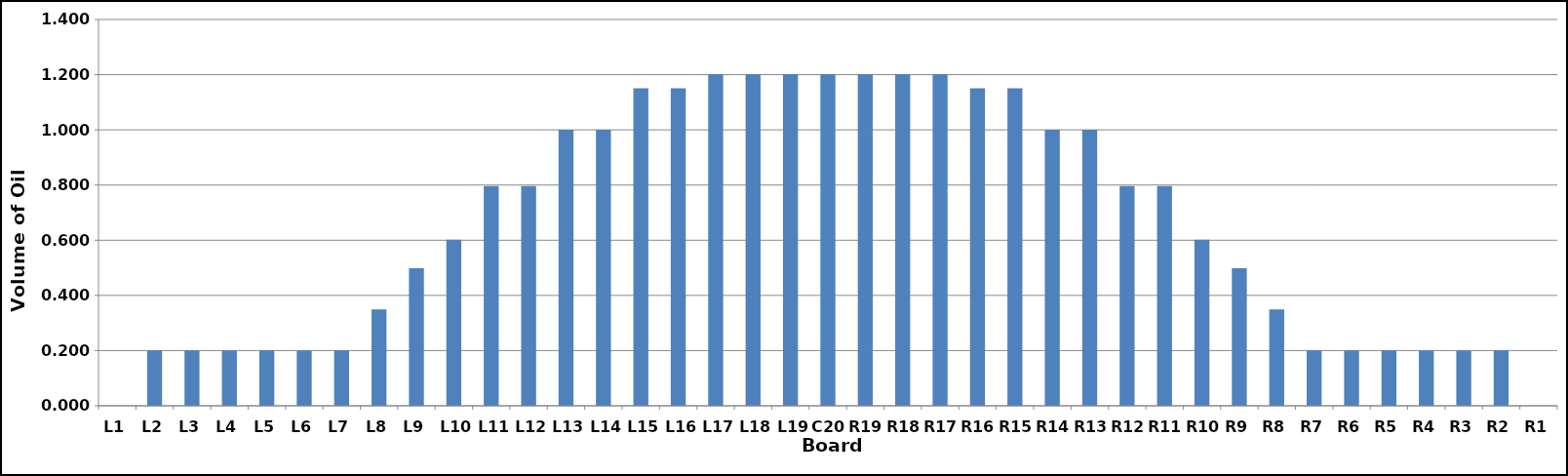
| Category | Series 0 |
|---|---|
| L1 | 0 |
| L2 | 0.2 |
| L3 | 0.2 |
| L4 | 0.2 |
| L5 | 0.2 |
| L6 | 0.2 |
| L7 | 0.2 |
| L8 | 0.349 |
| L9 | 0.499 |
| L10 | 0.602 |
| L11 | 0.796 |
| L12 | 0.796 |
| L13 | 1 |
| L14 | 1 |
| L15 | 1.151 |
| L16 | 1.151 |
| L17 | 1.202 |
| L18 | 1.202 |
| L19 | 1.202 |
| C20 | 1.202 |
| R19 | 1.202 |
| R18 | 1.202 |
| R17 | 1.202 |
| R16 | 1.151 |
| R15 | 1.151 |
| R14 | 1 |
| R13 | 1 |
| R12 | 0.796 |
| R11 | 0.796 |
| R10 | 0.602 |
| R9 | 0.499 |
| R8 | 0.349 |
| R7 | 0.2 |
| R6 | 0.2 |
| R5 | 0.2 |
| R4 | 0.2 |
| R3 | 0.2 |
| R2 | 0.2 |
| R1 | 0 |